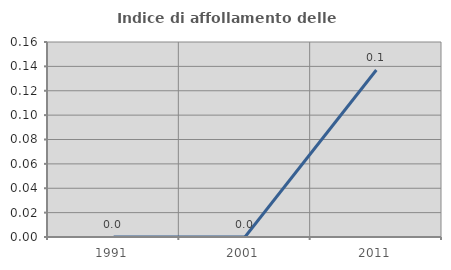
| Category | Indice di affollamento delle abitazioni  |
|---|---|
| 1991.0 | 0 |
| 2001.0 | 0 |
| 2011.0 | 0.137 |